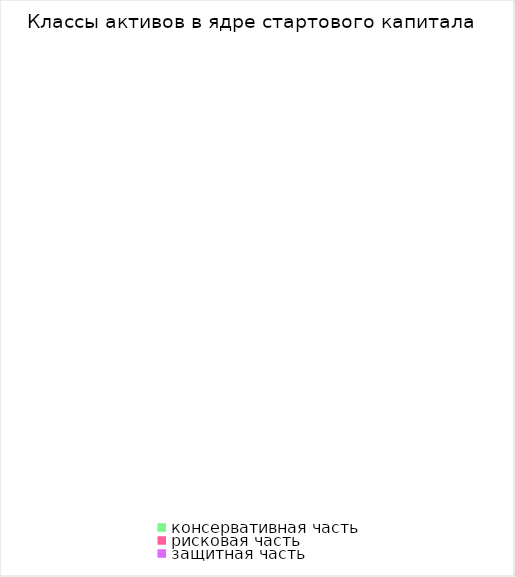
| Category | 1 |
|---|---|
| консервативная часть | 0 |
| рисковая часть | 0 |
| защитная часть | 0 |